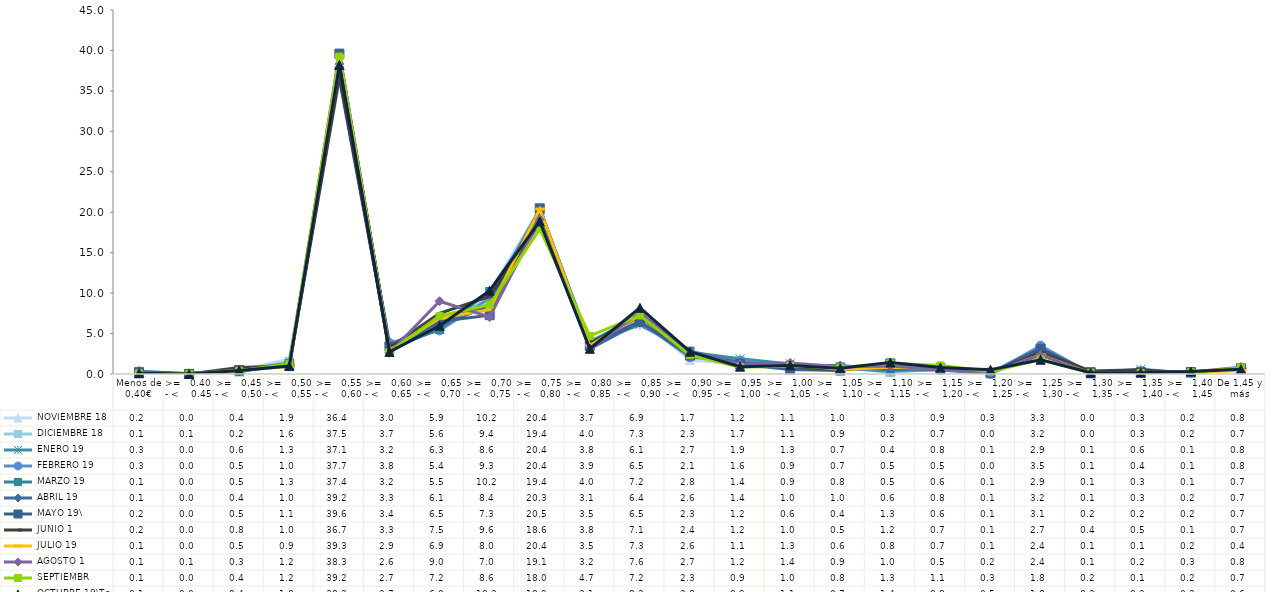
| Category |  NOVIEMBRE 18 |  DICIEMBRE 18 |  ENERO 19 |  FEBRERO 19 |  MARZO 19 |  ABRIL 19 |  MAYO 19\ |  JUNIO 1 |  JULIO 19 |  AGOSTO 1 |  SEPTIEMBR |  OCTUBRE 19\To |
|---|---|---|---|---|---|---|---|---|---|---|---|---|
| Menos de 0,40€ | 0.15 | 0.06 | 0.3 | 0.33 | 0.13 | 0.13 | 0.22 | 0.24 | 0.11 | 0.1 | 0.08 | 0.09 |
| >=   0.40 - <    0.45 | 0.01 | 0.08 | 0.02 | 0.02 | 0.02 | 0 | 0.01 | 0 | 0.01 | 0.05 | 0 | 0.01 |
| >=   0,45 - <    0,50 | 0.43 | 0.23 | 0.55 | 0.5 | 0.47 | 0.39 | 0.49 | 0.81 | 0.47 | 0.31 | 0.41 | 0.44 |
| >=   0,50 - <    0,55 | 1.86 | 1.55 | 1.31 | 1.04 | 1.28 | 1.02 | 1.07 | 1 | 0.91 | 1.17 | 1.23 | 0.98 |
| >=   0,55 - <    0,60 | 36.35 | 37.47 | 37.12 | 37.69 | 37.37 | 39.17 | 39.61 | 36.73 | 39.27 | 38.33 | 39.24 | 38.21 |
| >=   0,60 - <    0,65 | 3.01 | 3.73 | 3.21 | 3.83 | 3.17 | 3.3 | 3.38 | 3.27 | 2.92 | 2.62 | 2.72 | 2.73 |
| >=   0,65 - <   0,70 | 5.86 | 5.63 | 6.28 | 5.39 | 5.5 | 6.05 | 6.49 | 7.49 | 6.89 | 9 | 7.18 | 5.96 |
| >=   0,70 - <   0,75 | 10.16 | 9.42 | 8.64 | 9.33 | 10.2 | 8.41 | 7.27 | 9.59 | 7.95 | 7.04 | 8.58 | 10.3 |
| >=   0,75 - <   0,80 | 20.35 | 19.39 | 20.4 | 20.35 | 19.39 | 20.27 | 20.48 | 18.62 | 20.4 | 19.1 | 17.95 | 18.86 |
| >=   0,80 - <   0,85 | 3.69 | 3.99 | 3.76 | 3.94 | 3.95 | 3.11 | 3.49 | 3.79 | 3.53 | 3.15 | 4.71 | 3.12 |
| >=   0,85 - <   0,90 | 6.85 | 7.26 | 6.09 | 6.46 | 7.16 | 6.4 | 6.48 | 7.12 | 7.27 | 7.58 | 7.24 | 8.18 |
| >=   0,90 - <    0,95 | 1.73 | 2.3 | 2.7 | 2.08 | 2.83 | 2.55 | 2.28 | 2.42 | 2.59 | 2.74 | 2.33 | 2.76 |
| >=   0,95 - <   1,00 | 1.24 | 1.66 | 1.89 | 1.64 | 1.4 | 1.38 | 1.21 | 1.16 | 1.11 | 1.16 | 0.85 | 0.91 |
| >=   1,00 - <   1,05 | 1.13 | 1.07 | 1.25 | 0.86 | 0.94 | 0.98 | 0.56 | 0.96 | 1.25 | 1.37 | 0.96 | 1.06 |
| >=   1,05 - <    1,10 | 1.04 | 0.91 | 0.74 | 0.68 | 0.84 | 1.04 | 0.43 | 0.47 | 0.57 | 0.9 | 0.79 | 0.71 |
| >=   1,10 - <   1,15 | 0.33 | 0.17 | 0.35 | 0.48 | 0.53 | 0.56 | 1.31 | 1.17 | 0.83 | 0.98 | 1.33 | 1.42 |
| >=   1,15 - <    1,20 | 0.92 | 0.66 | 0.83 | 0.49 | 0.56 | 0.81 | 0.64 | 0.71 | 0.67 | 0.53 | 1.06 | 0.81 |
| >=   1,20 - <    1,25 | 0.27 | 0.01 | 0.06 | 0 | 0.14 | 0.1 | 0.12 | 0.13 | 0.11 | 0.16 | 0.31 | 0.52 |
| >=   1,25 - <    1,30 | 3.33 | 3.18 | 2.93 | 3.51 | 2.89 | 3.18 | 3.11 | 2.68 | 2.37 | 2.35 | 1.8 | 1.76 |
| >=   1,30 - <    1,35 | 0 | 0 | 0.12 | 0.1 | 0.13 | 0.06 | 0.23 | 0.38 | 0.07 | 0.11 | 0.15 | 0.15 |
| >=   1,35 - <    1,40 | 0.29 | 0.32 | 0.58 | 0.36 | 0.29 | 0.26 | 0.22 | 0.51 | 0.1 | 0.2 | 0.13 | 0.16 |
| >=   1,40 - <    1,45 | 0.17 | 0.21 | 0.09 | 0.14 | 0.14 | 0.15 | 0.24 | 0.06 | 0.18 | 0.25 | 0.22 | 0.3 |
| De 1,45 y más | 0.81 | 0.72 | 0.78 | 0.78 | 0.7 | 0.68 | 0.66 | 0.71 | 0.42 | 0.83 | 0.73 | 0.59 |